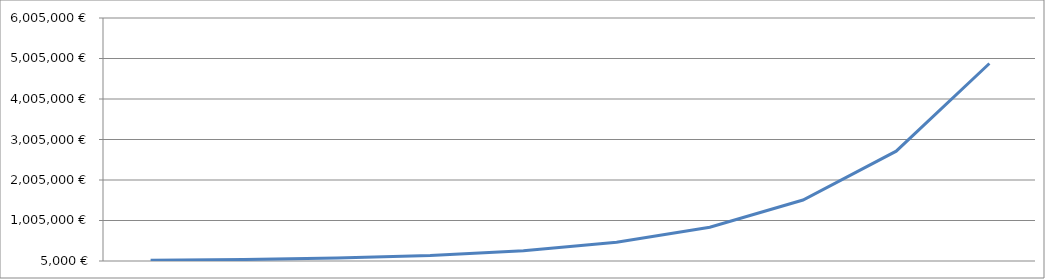
| Category | Series 0 |
|---|---|
| Jahr 1 | 21141.989 |
| Jahr 2 | 41151.399 |
| Jahr 3 | 77085.426 |
| Jahr 4 | 141617.775 |
| Jahr 5 | 257508.603 |
| Jahr 6 | 465631.878 |
| Jahr 7 | 839391.379 |
| Jahr 8 | 1510609.744 |
| Jahr 9 | 2716021.49 |
| Jahr 10 | 4880767.799 |